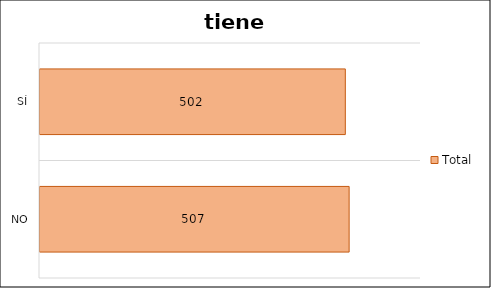
| Category | Total |
|---|---|
| No | 507 |
| Sí | 502 |